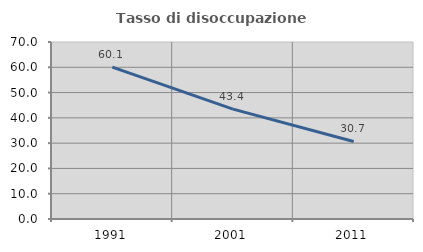
| Category | Tasso di disoccupazione giovanile  |
|---|---|
| 1991.0 | 60.057 |
| 2001.0 | 43.448 |
| 2011.0 | 30.667 |